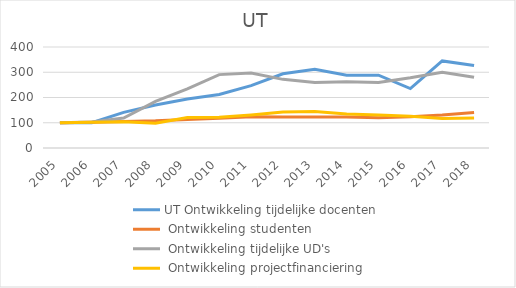
| Category | UT Ontwikkeling tijdelijke docenten | UT Ontwikkeling studenten | UT Ontwikkeling tijdelijke UD's | UT Ontwikkeling projectfinanciering |
|---|---|---|---|---|
| 2005.0 | 100 | 100 | 100 | 100 |
| 2006.0 | 100 | 102.43 | 103.125 | 101.881 |
| 2007.0 | 141.176 | 105.032 | 118.75 | 104.075 |
| 2008.0 | 170.588 | 107.436 | 184.375 | 98.433 |
| 2009.0 | 194.118 | 112.667 | 234.375 | 121.003 |
| 2010.0 | 211.765 | 117.369 | 290.625 | 121.317 |
| 2011.0 | 247.059 | 124.132 | 296.875 | 130.721 |
| 2012.0 | 294.118 | 123.022 | 271.875 | 142.79 |
| 2013.0 | 311.765 | 123.035 | 259.375 | 144.201 |
| 2014.0 | 288.235 | 122.348 | 262.5 | 134.796 |
| 2015.0 | 288.235 | 119.958 | 259.375 | 130.408 |
| 2016.0 | 235.294 | 124.039 | 278.125 | 125.549 |
| 2017.0 | 344.882 | 131.013 | 300.094 | 116.614 |
| 2018.0 | 326.353 | 140.88 | 280.031 | 118.809 |